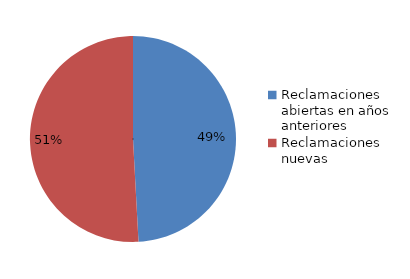
| Category | Series 0 |
|---|---|
| Reclamaciones abiertas en años anteriores | 173 |
| Reclamaciones nuevas   | 179 |